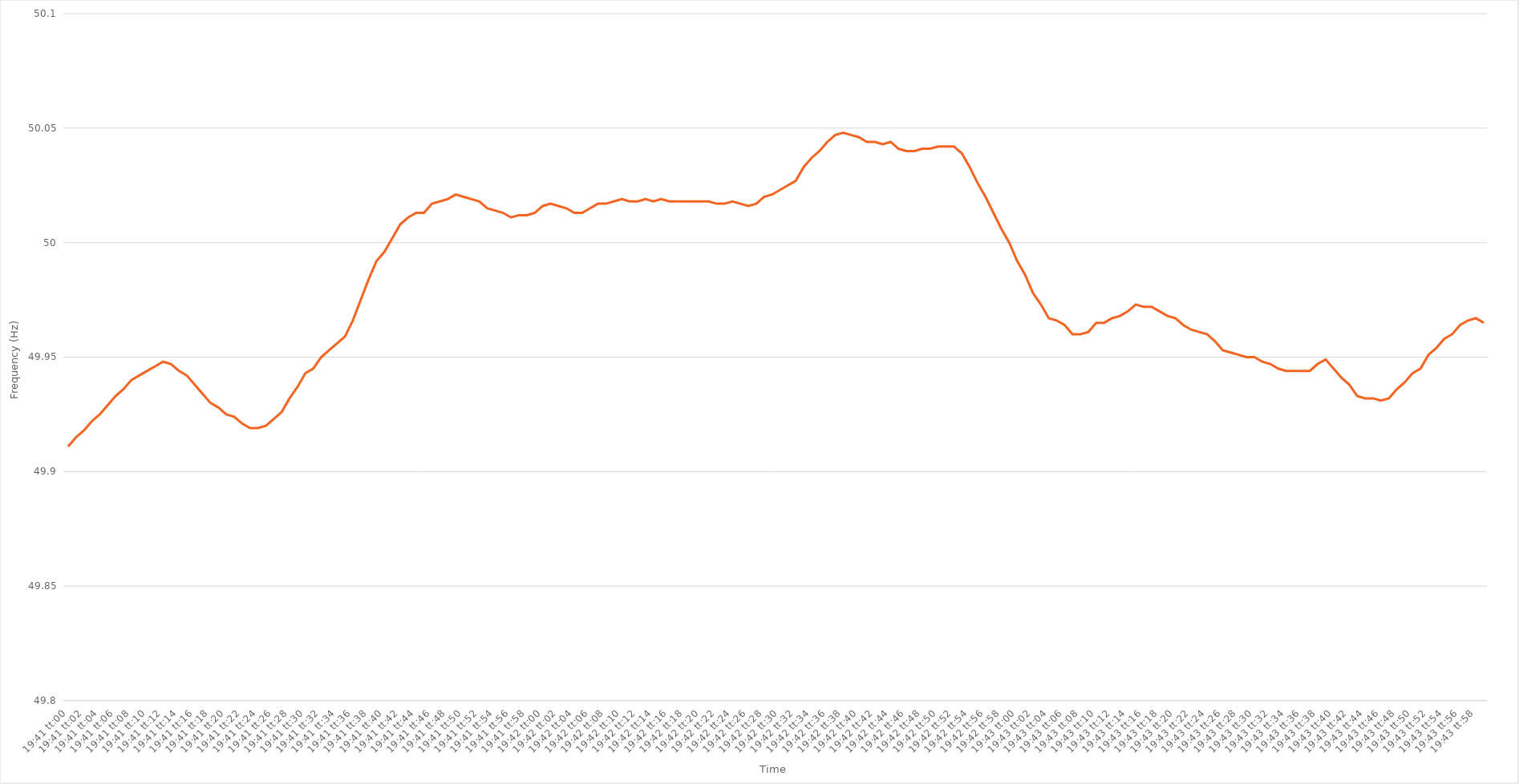
| Category | Series 0 |
|---|---|
| 0.8201388888888889 | 49.911 |
| 0.820150462962963 | 49.915 |
| 0.8201620370370369 | 49.918 |
| 0.8201736111111111 | 49.922 |
| 0.8201851851851852 | 49.925 |
| 0.8201967592592593 | 49.929 |
| 0.8202083333333333 | 49.933 |
| 0.8202199074074074 | 49.936 |
| 0.8202314814814815 | 49.94 |
| 0.8202430555555557 | 49.942 |
| 0.8202546296296296 | 49.944 |
| 0.8202662037037037 | 49.946 |
| 0.8202777777777778 | 49.948 |
| 0.8202893518518519 | 49.947 |
| 0.8203009259259259 | 49.944 |
| 0.8203125 | 49.942 |
| 0.8203240740740741 | 49.938 |
| 0.8203356481481481 | 49.934 |
| 0.8203472222222222 | 49.93 |
| 0.8203587962962963 | 49.928 |
| 0.8203703703703704 | 49.925 |
| 0.8203819444444443 | 49.924 |
| 0.8203935185185185 | 49.921 |
| 0.8204050925925926 | 49.919 |
| 0.8204166666666667 | 49.919 |
| 0.8204282407407407 | 49.92 |
| 0.8204398148148148 | 49.923 |
| 0.8204513888888889 | 49.926 |
| 0.8204629629629631 | 49.932 |
| 0.820474537037037 | 49.937 |
| 0.8204861111111111 | 49.943 |
| 0.8204976851851852 | 49.945 |
| 0.8205092592592593 | 49.95 |
| 0.8205208333333333 | 49.953 |
| 0.8205324074074074 | 49.956 |
| 0.8205439814814816 | 49.959 |
| 0.8205555555555556 | 49.966 |
| 0.8205671296296296 | 49.975 |
| 0.8205787037037037 | 49.984 |
| 0.8205902777777778 | 49.992 |
| 0.8206018518518517 | 49.996 |
| 0.8206134259259259 | 50.002 |
| 0.820625 | 50.008 |
| 0.8206365740740741 | 50.011 |
| 0.8206481481481481 | 50.013 |
| 0.8206597222222222 | 50.013 |
| 0.8206712962962963 | 50.017 |
| 0.8206828703703705 | 50.018 |
| 0.8206944444444444 | 50.019 |
| 0.8207060185185185 | 50.021 |
| 0.8207175925925926 | 50.02 |
| 0.8207291666666667 | 50.019 |
| 0.8207407407407407 | 50.018 |
| 0.8207523148148148 | 50.015 |
| 0.820763888888889 | 50.014 |
| 0.820775462962963 | 50.013 |
| 0.820787037037037 | 50.011 |
| 0.8207986111111111 | 50.012 |
| 0.8208101851851852 | 50.012 |
| 0.8208217592592592 | 50.013 |
| 0.8208333333333333 | 50.016 |
| 0.8208449074074075 | 50.017 |
| 0.8208564814814815 | 50.016 |
| 0.8208680555555555 | 50.015 |
| 0.8208796296296296 | 50.013 |
| 0.8208912037037037 | 50.013 |
| 0.8209027777777779 | 50.015 |
| 0.8209143518518518 | 50.017 |
| 0.820925925925926 | 50.017 |
| 0.8209375 | 50.018 |
| 0.8209490740740741 | 50.019 |
| 0.8209606481481481 | 50.018 |
| 0.8209722222222222 | 50.018 |
| 0.8209837962962964 | 50.019 |
| 0.8209953703703704 | 50.018 |
| 0.8210069444444444 | 50.019 |
| 0.8210185185185185 | 50.018 |
| 0.8210300925925926 | 50.018 |
| 0.8210416666666666 | 50.018 |
| 0.8210532407407407 | 50.018 |
| 0.8210648148148149 | 50.018 |
| 0.8210763888888889 | 50.018 |
| 0.8210879629629629 | 50.017 |
| 0.821099537037037 | 50.017 |
| 0.8211111111111111 | 50.018 |
| 0.8211226851851853 | 50.017 |
| 0.8211342592592592 | 50.016 |
| 0.8211458333333334 | 50.017 |
| 0.8211574074074074 | 50.02 |
| 0.8211689814814815 | 50.021 |
| 0.8211805555555555 | 50.023 |
| 0.8211921296296296 | 50.025 |
| 0.8212037037037038 | 50.027 |
| 0.8212152777777778 | 50.033 |
| 0.8212268518518518 | 50.037 |
| 0.8212384259259259 | 50.04 |
| 0.82125 | 50.044 |
| 0.821261574074074 | 50.047 |
| 0.8212731481481481 | 50.048 |
| 0.8212847222222223 | 50.047 |
| 0.8212962962962963 | 50.046 |
| 0.8213078703703703 | 50.044 |
| 0.8213194444444444 | 50.044 |
| 0.8213310185185185 | 50.043 |
| 0.8213425925925927 | 50.044 |
| 0.8213541666666666 | 50.041 |
| 0.8213657407407408 | 50.04 |
| 0.8213773148148148 | 50.04 |
| 0.821388888888889 | 50.041 |
| 0.8214004629629629 | 50.041 |
| 0.821412037037037 | 50.042 |
| 0.8214236111111112 | 50.042 |
| 0.8214351851851852 | 50.042 |
| 0.8214467592592593 | 50.039 |
| 0.8214583333333333 | 50.033 |
| 0.8214699074074074 | 50.026 |
| 0.8214814814814814 | 50.02 |
| 0.8214930555555555 | 50.013 |
| 0.8215046296296297 | 50.006 |
| 0.8215162037037037 | 50 |
| 0.8215277777777777 | 49.992 |
| 0.8215393518518518 | 49.986 |
| 0.8215509259259259 | 49.978 |
| 0.8215625000000001 | 49.973 |
| 0.821574074074074 | 49.967 |
| 0.8215856481481482 | 49.966 |
| 0.8215972222222222 | 49.964 |
| 0.8216087962962964 | 49.96 |
| 0.8216203703703703 | 49.96 |
| 0.8216319444444444 | 49.961 |
| 0.8216435185185186 | 49.965 |
| 0.8216550925925926 | 49.965 |
| 0.8216666666666667 | 49.967 |
| 0.8216782407407407 | 49.968 |
| 0.8216898148148148 | 49.97 |
| 0.821701388888889 | 49.973 |
| 0.8217129629629629 | 49.972 |
| 0.8217245370370371 | 49.972 |
| 0.8217361111111111 | 49.97 |
| 0.8217476851851853 | 49.968 |
| 0.8217592592592592 | 49.967 |
| 0.8217708333333333 | 49.964 |
| 0.8217824074074075 | 49.962 |
| 0.8217939814814814 | 49.961 |
| 0.8218055555555556 | 49.96 |
| 0.8218171296296296 | 49.957 |
| 0.8218287037037038 | 49.953 |
| 0.8218402777777777 | 49.952 |
| 0.8218518518518518 | 49.951 |
| 0.821863425925926 | 49.95 |
| 0.821875 | 49.95 |
| 0.8218865740740741 | 49.948 |
| 0.8218981481481481 | 49.947 |
| 0.8219097222222222 | 49.945 |
| 0.8219212962962964 | 49.944 |
| 0.8219328703703703 | 49.944 |
| 0.8219444444444445 | 49.944 |
| 0.8219560185185185 | 49.944 |
| 0.8219675925925927 | 49.947 |
| 0.8219791666666666 | 49.949 |
| 0.8219907407407407 | 49.945 |
| 0.8220023148148149 | 49.941 |
| 0.8220138888888888 | 49.938 |
| 0.822025462962963 | 49.933 |
| 0.822037037037037 | 49.932 |
| 0.8220486111111112 | 49.932 |
| 0.8220601851851851 | 49.931 |
| 0.8220717592592592 | 49.932 |
| 0.8220833333333334 | 49.936 |
| 0.8220949074074074 | 49.939 |
| 0.8221064814814815 | 49.943 |
| 0.8221180555555555 | 49.945 |
| 0.8221296296296297 | 49.951 |
| 0.8221412037037038 | 49.954 |
| 0.8221527777777777 | 49.958 |
| 0.8221643518518519 | 49.96 |
| 0.8221759259259259 | 49.964 |
| 0.8221875000000001 | 49.966 |
| 0.822199074074074 | 49.967 |
| 0.8222106481481481 | 49.965 |